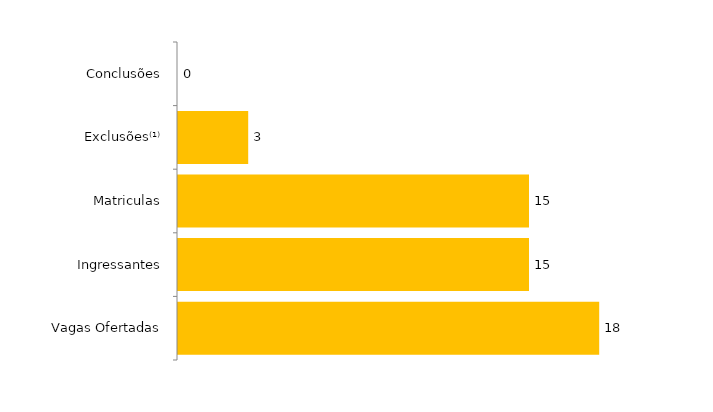
| Category | Total (2010) |
|---|---|
| Vagas Ofertadas | 18 |
| Ingressantes | 15 |
| Matriculas | 15 |
| Exclusões⁽¹⁾ | 3 |
| Conclusões | 0 |